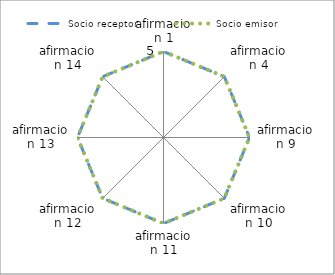
| Category | Socio receptor  | Socio emisor |
|---|---|---|
| afirmacion 1 | 5 | 5 |
| afirmacion 4 | 5 | 5 |
| afirmacion 9 | 5 | 5 |
| afirmacion 10 | 5 | 5 |
| afirmacion 11 | 5 | 5 |
| afirmacion 12 | 5 | 5 |
| afirmacion 13 | 5 | 5 |
| afirmacion 14 | 5 | 5 |